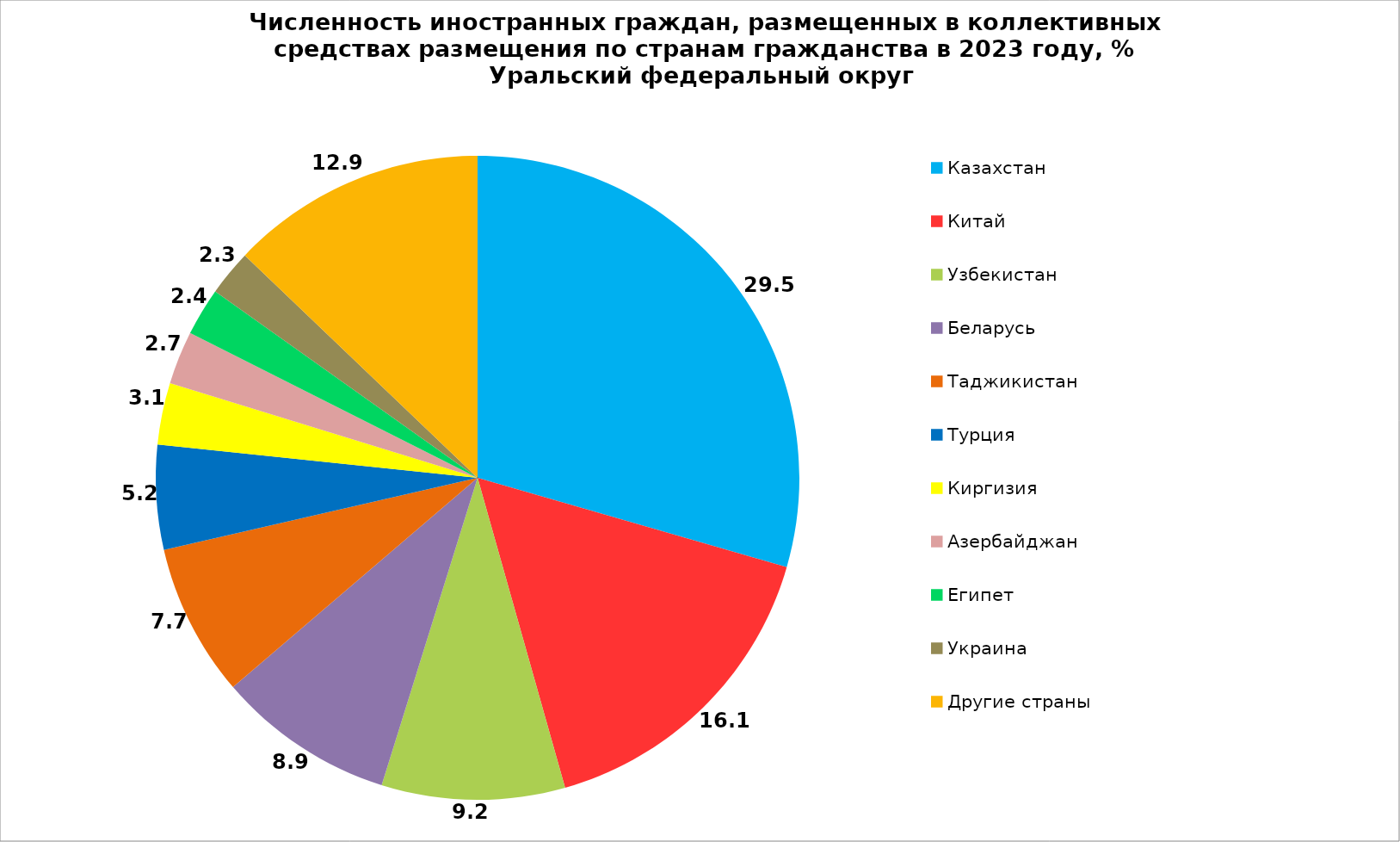
| Category | Series 0 |
|---|---|
| Казахстан | 29.473 |
| Китай | 16.141 |
| Узбекистан | 9.204 |
| Беларусь | 8.919 |
| Таджикистан | 7.671 |
| Турция | 5.242 |
| Киргизия | 3.103 |
| Азербайджан | 2.67 |
| Египет | 2.407 |
| Украина | 2.306 |
| Другие страны | 12.863 |